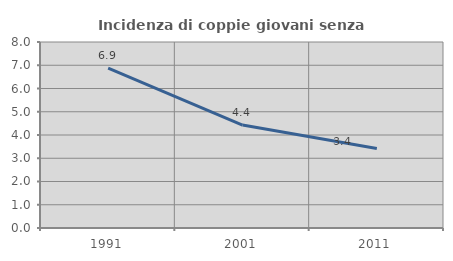
| Category | Incidenza di coppie giovani senza figli |
|---|---|
| 1991.0 | 6.875 |
| 2001.0 | 4.426 |
| 2011.0 | 3.415 |